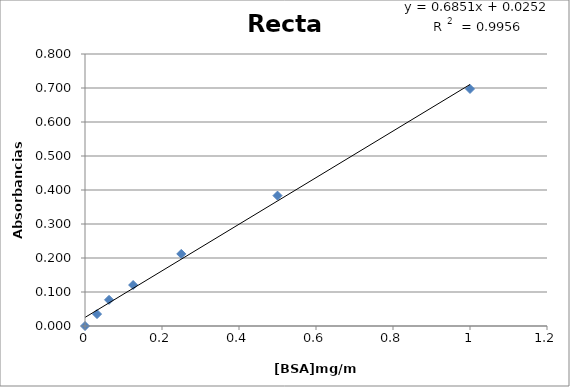
| Category | Series 0 |
|---|---|
| 1.0 | 0.697 |
| 0.5 | 0.384 |
| 0.25 | 0.212 |
| 0.125 | 0.121 |
| 0.0625 | 0.077 |
| 0.03125 | 0.035 |
| 0.0 | 0 |